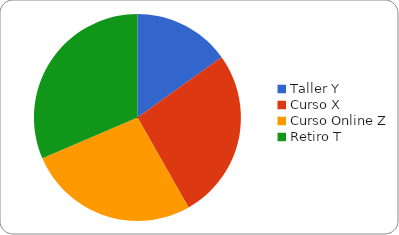
| Category | Series 0 |
|---|---|
| Taller Y | 10177 |
| Curso X | 18000 |
| Curso Online Z | 18050 |
| Retiro T | 21210 |